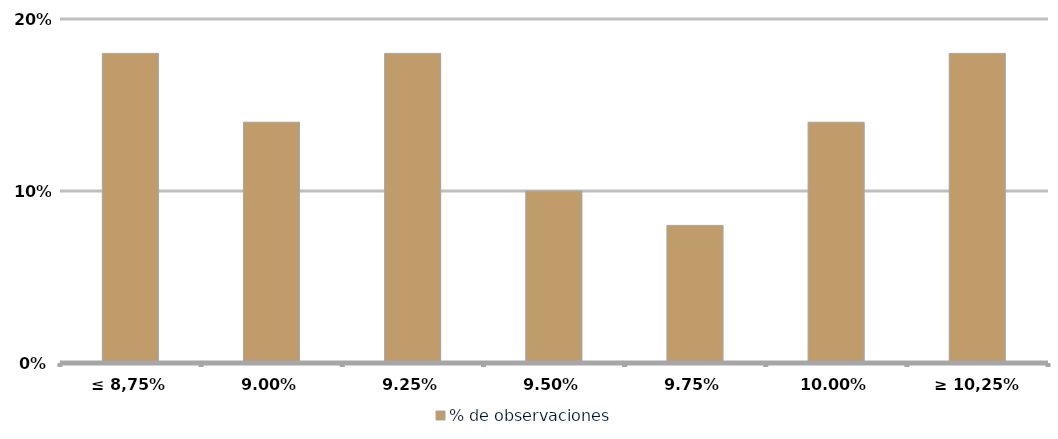
| Category | % de observaciones  |
|---|---|
| ≤ 8,75% | 0.18 |
| 9,00% | 0.14 |
| 9,25% | 0.18 |
| 9,50% | 0.1 |
| 9,75% | 0.08 |
| 10,00% | 0.14 |
| ≥ 10,25% | 0.18 |